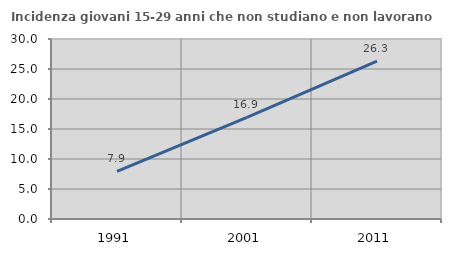
| Category | Incidenza giovani 15-29 anni che non studiano e non lavorano  |
|---|---|
| 1991.0 | 7.921 |
| 2001.0 | 16.949 |
| 2011.0 | 26.316 |